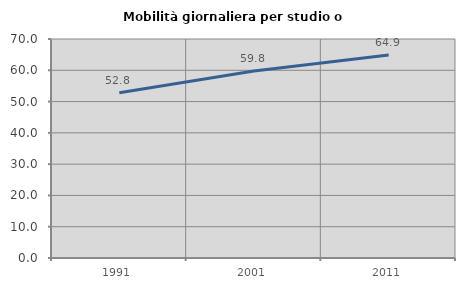
| Category | Mobilità giornaliera per studio o lavoro |
|---|---|
| 1991.0 | 52.807 |
| 2001.0 | 59.768 |
| 2011.0 | 64.907 |